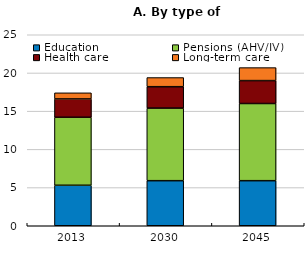
| Category | Education | Pensions (AHV/IV) | Health care | Long-term care |
|---|---|---|---|---|
| 2013.0 | 5.3 | 8.9 | 2.4 | 0.8 |
| 2030.0 | 5.9 | 9.5 | 2.8 | 1.2 |
| 2045.0 | 5.9 | 10.1 | 3 | 1.7 |